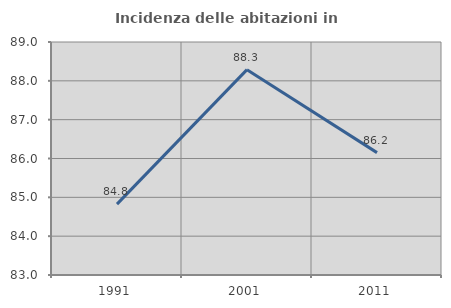
| Category | Incidenza delle abitazioni in proprietà  |
|---|---|
| 1991.0 | 84.825 |
| 2001.0 | 88.288 |
| 2011.0 | 86.151 |